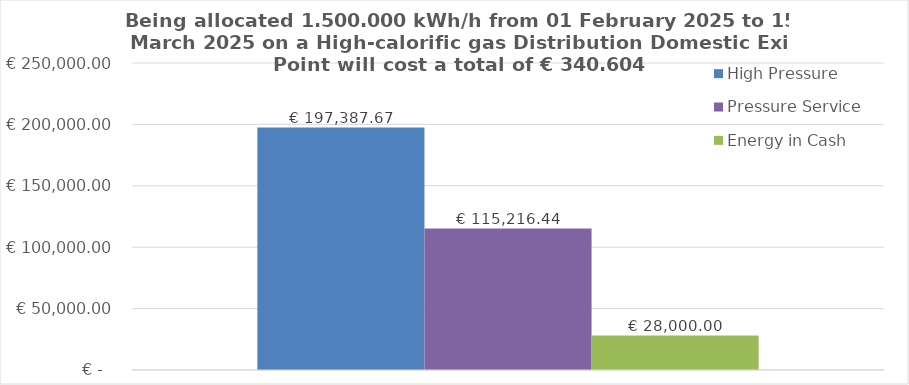
| Category | High Pressure | Pressure Service | Energy in Cash  |
|---|---|---|---|
|  | 197387.671 | 115216.438 | 28000 |